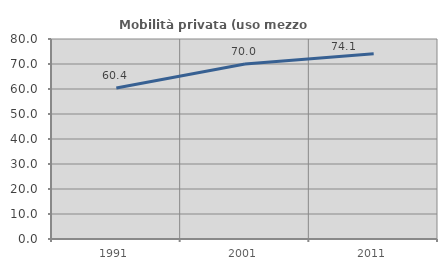
| Category | Mobilità privata (uso mezzo privato) |
|---|---|
| 1991.0 | 60.389 |
| 2001.0 | 69.997 |
| 2011.0 | 74.143 |